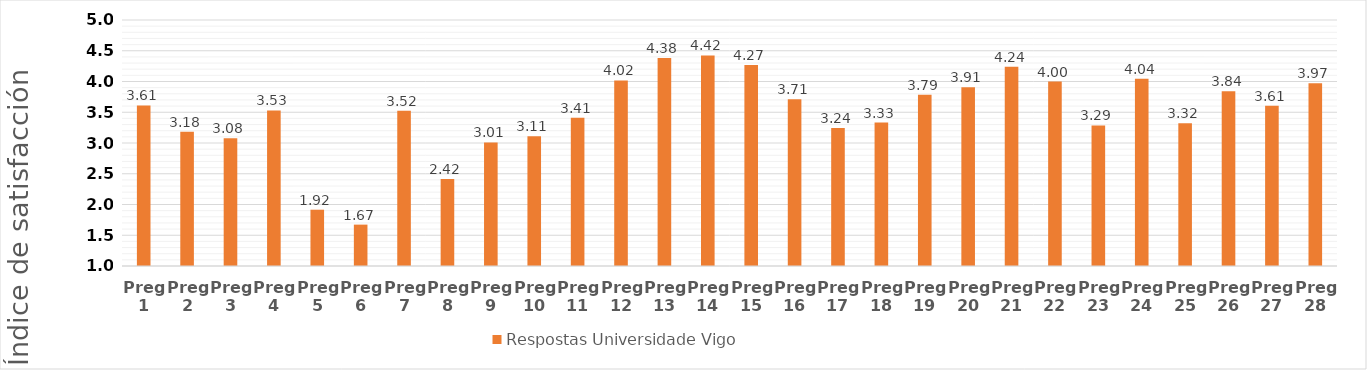
| Category | Respostas Universidade Vigo |
|---|---|
| Preg 1 | 3.612 |
| Preg 2 | 3.183 |
| Preg 3 | 3.078 |
| Preg 4 | 3.53 |
| Preg 5 | 1.915 |
| Preg 6 | 1.673 |
| Preg 7 | 3.525 |
| Preg 8 | 2.416 |
| Preg 9 | 3.008 |
| Preg 10 | 3.108 |
| Preg 11 | 3.41 |
| Preg 12 | 4.017 |
| Preg 13 | 4.381 |
| Preg 14 | 4.424 |
| Preg 15 | 4.269 |
| Preg 16 | 3.709 |
| Preg 17 | 3.243 |
| Preg 18 | 3.333 |
| Preg 19 | 3.786 |
| Preg 20 | 3.907 |
| Preg 21 | 4.241 |
| Preg 22 | 4 |
| Preg 23 | 3.286 |
| Preg 24 | 4.044 |
| Preg 25 | 3.32 |
| Preg 26 | 3.84 |
| Preg 27 | 3.607 |
| Preg 28 | 3.97 |